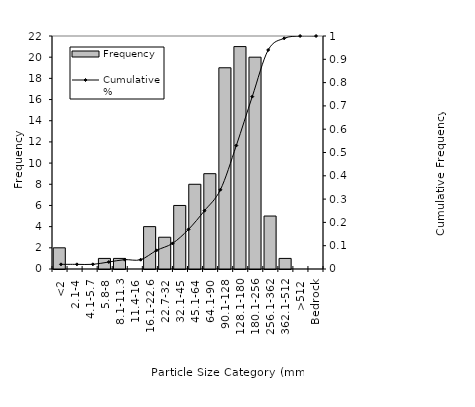
| Category | Frequency |
|---|---|
| <2 | 2 |
| 2.1-4 | 0 |
| 4.1-5.7 | 0 |
| 5.8-8 | 1 |
| 8.1-11.3 | 1 |
| 11.4-16 | 0 |
| 16.1-22.6 | 4 |
| 22.7-32 | 3 |
| 32.1-45 | 6 |
| 45.1-64 | 8 |
| 64.1-90 | 9 |
| 90.1-128 | 19 |
| 128.1-180 | 21 |
| 180.1-256 | 20 |
| 256.1-362 | 5 |
| 362.1-512 | 1 |
| >512 | 0 |
| Bedrock | 0 |